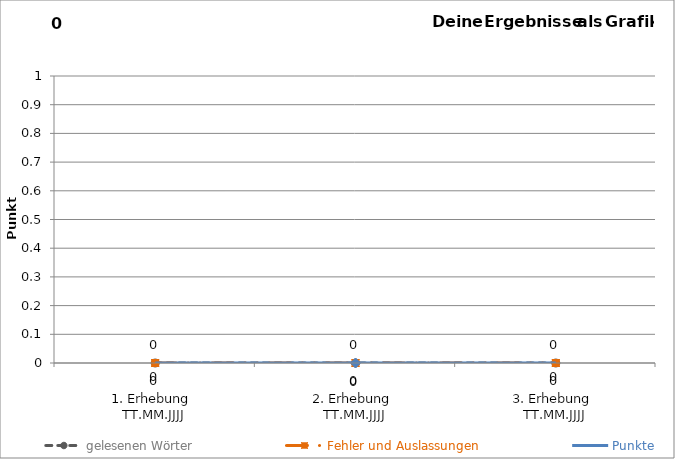
| Category | gelesenen Wörter | Fehler und Auslassungen | Punkte |
|---|---|---|---|
| 1. Erhebung 
TT.MM.JJJJ | 0 | 0 | 0 |
| 2. Erhebung 
TT.MM.JJJJ | 0 | 0 | 0 |
| 3. Erhebung 
TT.MM.JJJJ | 0 | 0 | 0 |